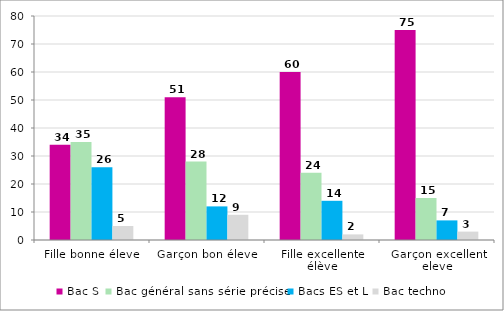
| Category | Bac S | Bac général sans série précise | Bacs ES et L | Bac techno |
|---|---|---|---|---|
| Fille bonne éleve | 34 | 35 | 26 | 5 |
| Garçon bon éleve | 51 | 28 | 12 | 9 |
| Fille excellente élève | 60 | 24 | 14 | 2 |
| Garçon excellent eleve | 75 | 15 | 7 | 3 |